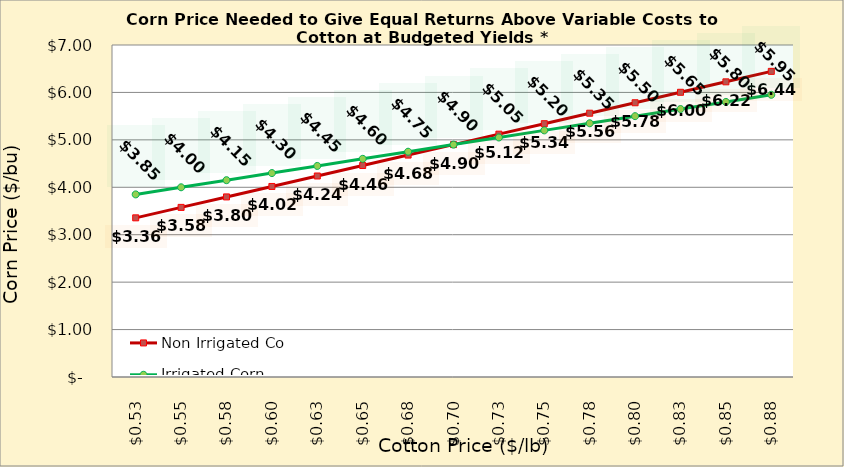
| Category | Non Irrigated Corn | Irrigated Corn |
|---|---|---|
| 0.5249999999999998 | 3.356 | 3.85 |
| 0.5499999999999998 | 3.576 | 4 |
| 0.5749999999999998 | 3.797 | 4.15 |
| 0.5999999999999999 | 4.018 | 4.3 |
| 0.6249999999999999 | 4.238 | 4.45 |
| 0.6499999999999999 | 4.459 | 4.6 |
| 0.6749999999999999 | 4.679 | 4.75 |
| 0.7 | 4.9 | 4.9 |
| 0.725 | 5.12 | 5.05 |
| 0.75 | 5.341 | 5.2 |
| 0.775 | 5.562 | 5.35 |
| 0.8 | 5.782 | 5.5 |
| 0.8250000000000001 | 6.003 | 5.65 |
| 0.8500000000000001 | 6.223 | 5.8 |
| 0.8750000000000001 | 6.444 | 5.95 |